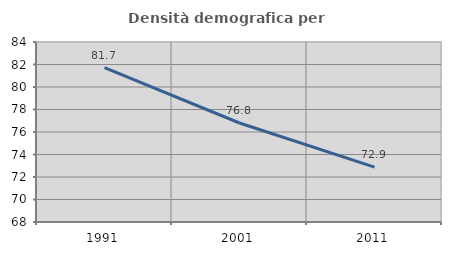
| Category | Densità demografica |
|---|---|
| 1991.0 | 81.73 |
| 2001.0 | 76.801 |
| 2011.0 | 72.872 |